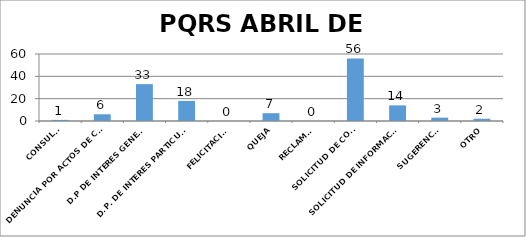
| Category | Series 0 |
|---|---|
| CONSULTA | 1 |
| DENUNCIA POR ACTOS DE CORRUPCION | 6 |
| D.P DE INTERES GENERAL | 33 |
| D.P. DE INTERES PARTICULAR | 18 |
| FELICITACION | 0 |
| QUEJA | 7 |
| RECLAMO | 0 |
| SOLICITUD DE COPIA | 56 |
| SOLICITUD DE INFORMACION | 14 |
| SUGERENCIA | 3 |
| OTRO | 2 |